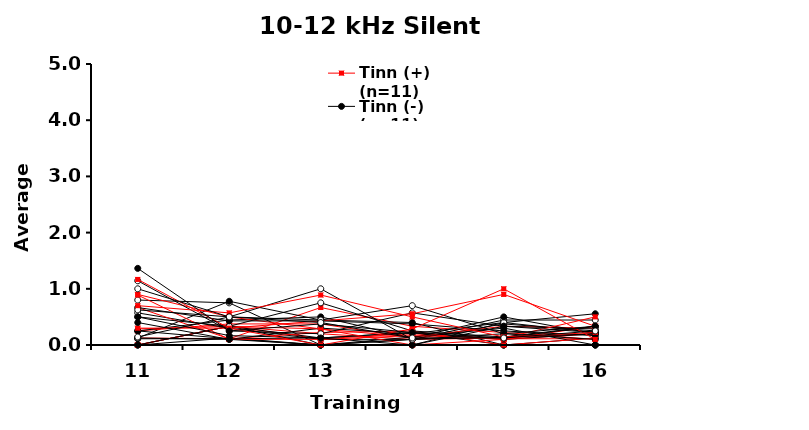
| Category | Tinn (+) (n=11) | Tinn (-) (n=11) | Ctrl (n=8) | CI03 | CI04 | CI05 | CI06 | CI07 | CI08 | CI09 | CI10 | DS18 | CI11 | CI12 | DS19 | CI13 | CI14 | DS20 | CI15 | CI16 | DS21 | CI17 | CI18 | DS22 | CI19 | CI20 | DS23 | CI21 | CI22 | DS24 |
|---|---|---|---|---|---|---|---|---|---|---|---|---|---|---|---|---|---|---|---|---|---|---|---|---|---|---|---|---|---|---|
| 11.0 | 0.125 | 0 | 0.8 | 0 | 0.125 | 0 | 0.286 | 0 | 0.111 | 0.25 | 0 | 0.571 | 0.25 | 0.667 | 0.125 | 0.25 | 0.9 | 1.143 | 0.889 | 0.3 | 0.5 | 0.5 | 0.667 | 0.143 | 0.4 | 1.167 | 0.625 | 1.364 | 0.7 | 1 |
| 12.0 | 0.111 | 0.333 | 0.75 | 0.125 | 0.778 | 0.333 | 0.333 | 0.333 | 0.111 | 0.375 | 0.333 | 0.3 | 0.111 | 0.111 | 0.1 | 0.444 | 0.5 | 0.25 | 0.1 | 0.3 | 0.333 | 0.167 | 0.429 | 0.5 | 0.1 | 0.3 | 0.5 | 0.25 | 0.571 | 0.5 |
| 13.0 | 0.667 | 0 | 0 | 0 | 0.444 | 0.286 | 0.2 | 0.111 | 0.125 | 0.375 | 0.125 | 0.1 | 0 | 0.222 | 0.3 | 0.5 | 0.286 | 0.2 | 0.1 | 0.429 | 0.75 | 0.125 | 0.429 | 0.444 | 0 | 0 | 1 | 0.375 | 0.889 | 0.4 |
| 14.0 | 0.333 | 0 | 0.1 | 0 | 0.4 | 0.143 | 0.1 | 0.2 | 0.222 | 0.125 | 0.222 | 0.1 | 0.143 | 0.25 | 0.2 | 0.125 | 0 | 0.571 | 0.167 | 0.556 | 0.25 | 0 | 0.375 | 0.7 | 0.1 | 0.286 | 0.1 | 0.222 | 0.5 | 0.125 |
| 15.0 | 0.222 | 0.4 | 0.375 | 0 | 0 | 0.333 | 0.125 | 0.1 | 0.1 | 0.111 | 0 | 0.444 | 0.3 | 0 | 0.4 | 0.5 | 0.1 | 0.333 | 0.125 | 0.9 | 0.143 | 0.333 | 0.25 | 0.2 | 0.2 | 1 | 0.143 | 0.125 | 0.143 | 0.125 |
| 16.0 | 0.1 | 0.556 | 0.25 | 0.125 | 0 | 0.3 | 0.2 | 0.2 | 0.2 | 0.111 | 0 | 0.444 | 0 | 0.125 | 0.222 | 0.2 | 0.333 | 0.286 | 0.5 | 0.333 | 0.2 | 0.222 | 0.167 | 0.333 | 0.1 | 0.1 | 0.333 | 0.333 | 0.222 | 0.25 |